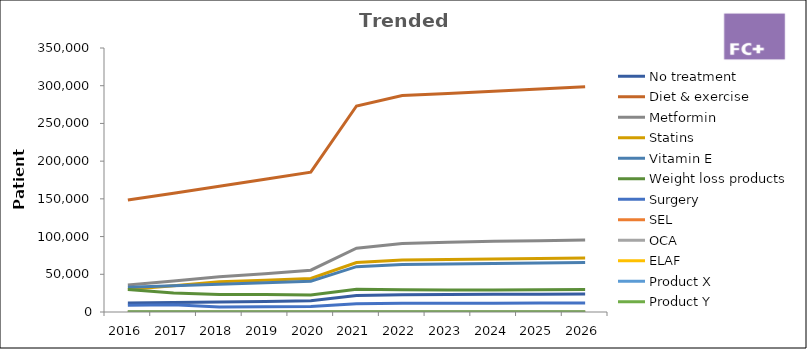
| Category | No treatment | Diet & exercise | Metformin | Statins | Vitamin E | Weight loss products | Surgery | SEL | OCA | ELAF | Product X | Product Y |
|---|---|---|---|---|---|---|---|---|---|---|---|---|
| 2016.0 | 11880 | 148500 | 35640 | 29700 | 32670 | 29700 | 8910 | 0 | 0 | 0 | 0 | 0 |
| 2017.0 | 12598.74 | 157484.25 | 40945.905 | 34646.535 | 34646.535 | 25197.48 | 9449.055 | 0 | 0 | 0 | 0 | 0 |
| 2018.0 | 13330.667 | 166633.335 | 46657.334 | 39992 | 36659.334 | 23328.667 | 6665.333 | 0 | 0 | 0 | 0 | 0 |
| 2019.0 | 14075.972 | 175949.653 | 50628.845 | 42227.917 | 38708.924 | 23270.009 | 7037.986 | 0 | 0 | 0 | 0 | 0 |
| 2020.0 | 14834.851 | 185435.635 | 55434.988 | 44504.552 | 40795.84 | 22447.979 | 7417.425 | 0 | 0 | 0 | 0 | 0 |
| 2021.0 | 21850.499 | 273131.237 | 84525.096 | 65551.497 | 60088.872 | 30190.024 | 10925.249 | 0 | 0 | 0 | 0 | 0 |
| 2022.0 | 22951.764 | 286897.051 | 90835.61 | 68855.292 | 63117.351 | 29661.151 | 11475.882 | 0 | 0 | 0 | 0 | 0 |
| 2023.0 | 23181.282 | 289766.022 | 92462.939 | 69543.845 | 63748.525 | 29238.79 | 11590.641 | 0 | 0 | 0 | 0 | 0 |
| 2024.0 | 23413.095 | 292663.682 | 93652.378 | 70239.284 | 64386.01 | 29266.368 | 11706.547 | 0 | 0 | 0 | 0 | 0 |
| 2025.0 | 23647.225 | 295590.319 | 94588.902 | 70941.676 | 65029.87 | 29559.032 | 11823.613 | 0 | 0 | 0 | 0 | 0 |
| 2026.0 | 23883.698 | 298546.222 | 95534.791 | 71651.093 | 65680.169 | 29854.622 | 11941.849 | 0 | 0 | 0 | 0 | 0 |